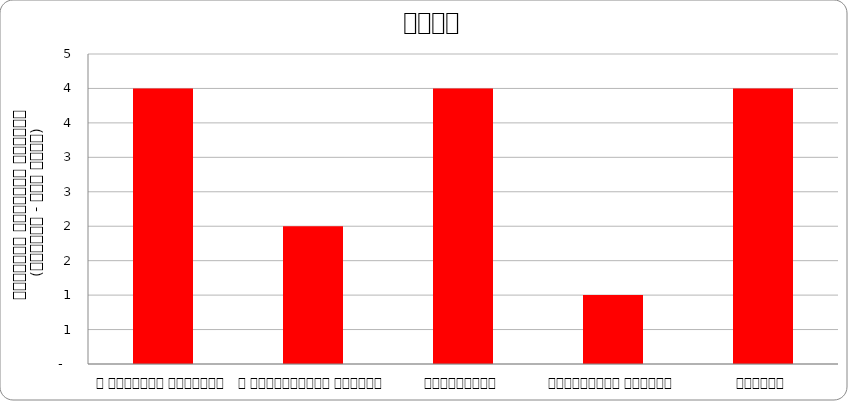
| Category | समाज |
|---|---|
| द हिमालयन टाइम्स् | 4 |
| द काठमाण्डौं पोस्ट् | 2 |
| कान्तिपुर | 4 |
| अन्नपूर्ण पोस्ट् | 1 |
| नागरिक | 4 |